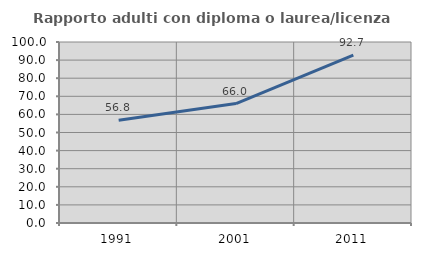
| Category | Rapporto adulti con diploma o laurea/licenza media  |
|---|---|
| 1991.0 | 56.767 |
| 2001.0 | 65.991 |
| 2011.0 | 92.688 |